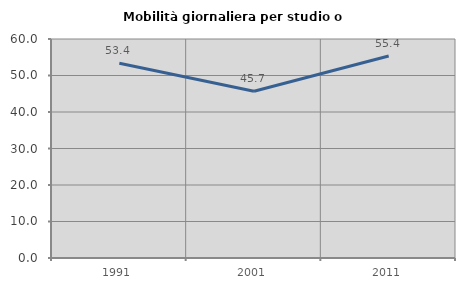
| Category | Mobilità giornaliera per studio o lavoro |
|---|---|
| 1991.0 | 53.354 |
| 2001.0 | 45.697 |
| 2011.0 | 55.357 |